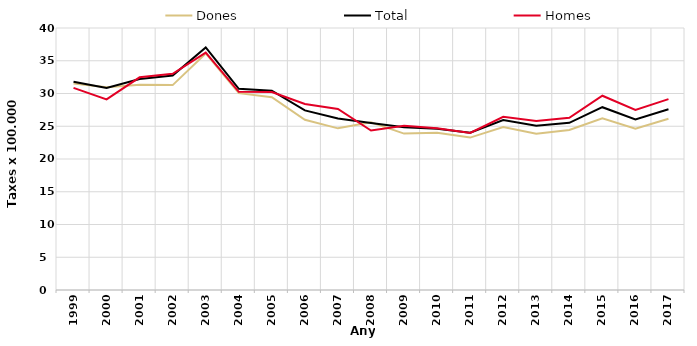
| Category | Dones | Total | Homes |
|---|---|---|---|
| 1999.0 | 31.54 | 31.8 | 30.86 |
| 2000.0 | 30.97 | 30.84 | 29.11 |
| 2001.0 | 31.33 | 32.21 | 32.47 |
| 2002.0 | 31.28 | 32.74 | 33.01 |
| 2003.0 | 36.11 | 37.03 | 36.24 |
| 2004.0 | 30.05 | 30.71 | 30.26 |
| 2005.0 | 29.43 | 30.43 | 30.23 |
| 2006.0 | 25.98 | 27.42 | 28.41 |
| 2007.0 | 24.68 | 26.18 | 27.63 |
| 2008.0 | 25.59 | 25.49 | 24.34 |
| 2009.0 | 23.88 | 24.84 | 25.07 |
| 2010.0 | 23.99 | 24.6 | 24.68 |
| 2011.0 | 23.27 | 24 | 23.97 |
| 2012.0 | 24.88 | 25.96 | 26.45 |
| 2013.0 | 23.86 | 25.07 | 25.81 |
| 2014.0 | 24.43 | 25.52 | 26.3 |
| 2015.0 | 26.22 | 27.91 | 29.66 |
| 2016.0 | 24.64 | 26.04 | 27.48 |
| 2017.0 | 26.14 | 27.6 | 29.14 |